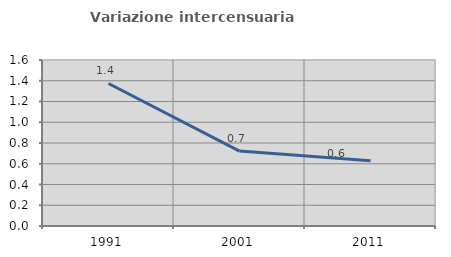
| Category | Variazione intercensuaria annua |
|---|---|
| 1991.0 | 1.374 |
| 2001.0 | 0.722 |
| 2011.0 | 0.628 |